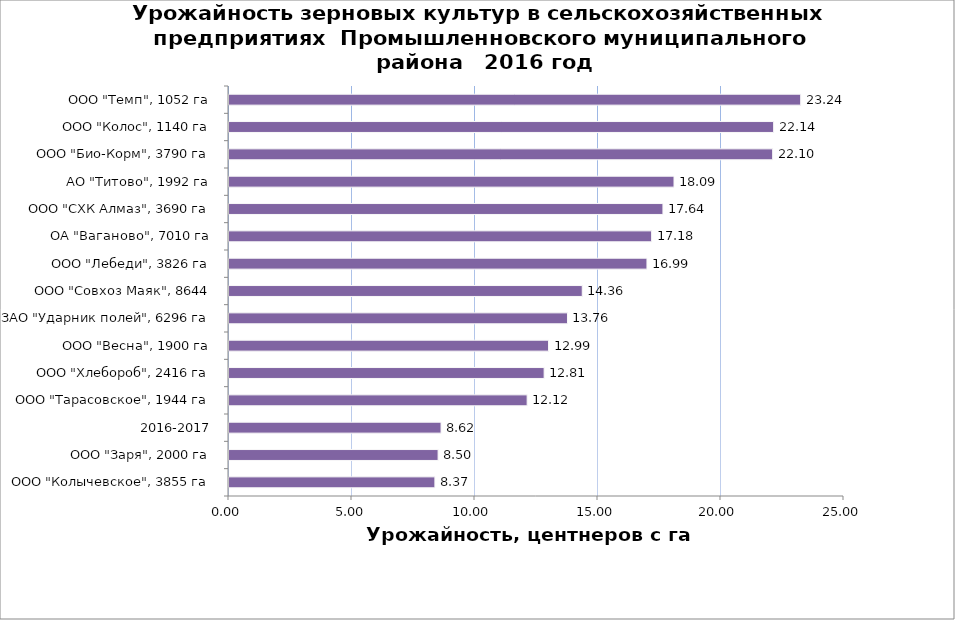
| Category | Series 0 |
|---|---|
| ООО "Колычевское", 3855 га | 8.37 |
| ООО "Заря", 2000 га | 8.5 |
| 2016-2017 | 8.62 |
| ООО "Тарасовское", 1944 га | 12.12 |
| ООО "Хлебороб", 2416 га | 12.81 |
| ООО "Весна", 1900 га | 12.99 |
| ЗАО "Ударник полей", 6296 га | 13.76 |
| ООО "Совхоз Маяк", 8644 | 14.36 |
| ООО "Лебеди", 3826 га | 16.99 |
| ОА "Ваганово", 7010 га | 17.18 |
| ООО "СХК Алмаз", 3690 га | 17.64 |
| АО "Титово", 1992 га | 18.09 |
| ООО "Био-Корм", 3790 га | 22.1 |
| ООО "Колос", 1140 га | 22.14 |
| ООО "Темп", 1052 га | 23.24 |